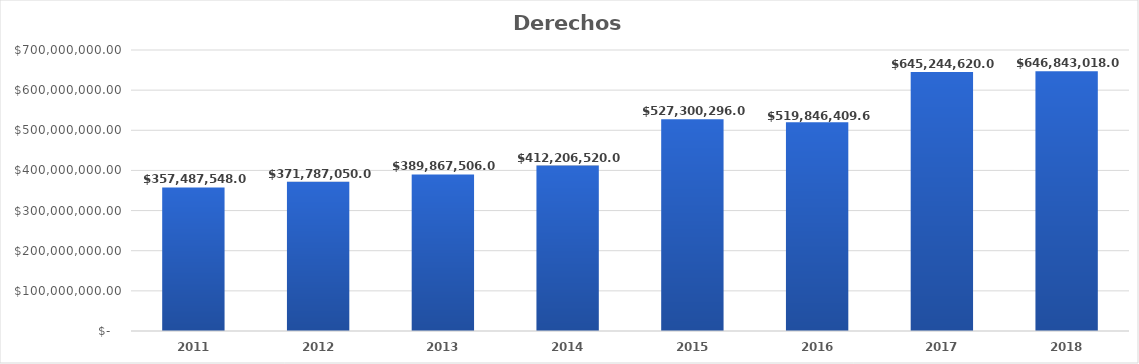
| Category | Derechos (total) |
|---|---|
| 2011.0 | 357487548 |
| 2012.0 | 371787050 |
| 2013.0 | 389867506 |
| 2014.0 | 412206520 |
| 2015.0 | 527300296 |
| 2016.0 | 519846409.68 |
| 2017.0 | 645244620 |
| 2018.0 | 646843018 |